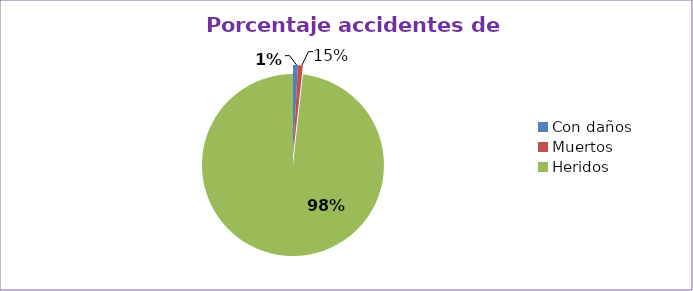
| Category | Series 0 |
|---|---|
| Con daños  | 0.87 |
| Muertos  | 0.87 |
| Heridos  | 98.261 |